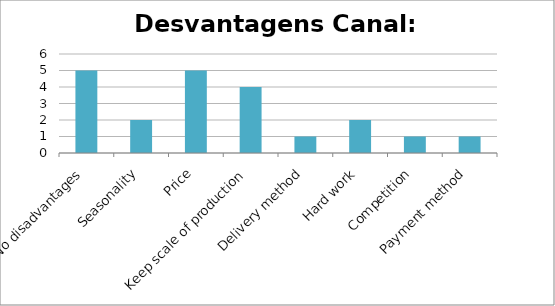
| Category | Series 0 |
|---|---|
| No disadvantages | 5 |
| Seasonality | 2 |
| Price | 5 |
| Keep scale of production | 4 |
| Delivery method | 1 |
| Hard work | 2 |
| Competition | 1 |
| Payment method | 1 |